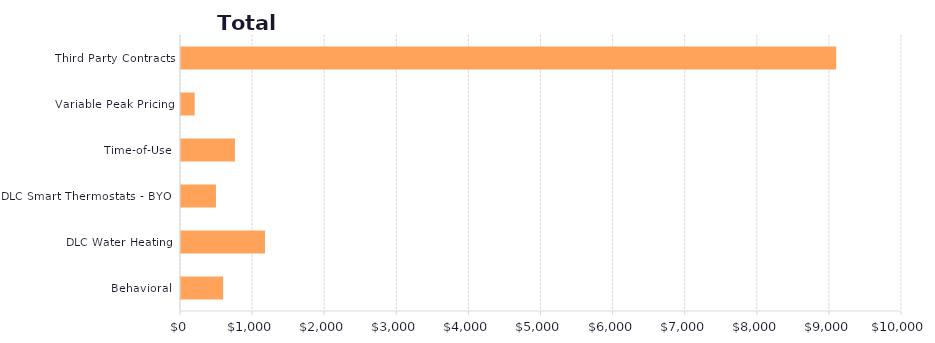
| Category | Series 1 |
|---|---|
| Behavioral | 584.29 |
| DLC Water Heating | 1164.701 |
| DLC Smart Thermostats - BYOT | 485.031 |
| Time-of-Use | 748.261 |
| Variable Peak Pricing | 189.928 |
| Third Party Contracts | 9087.451 |